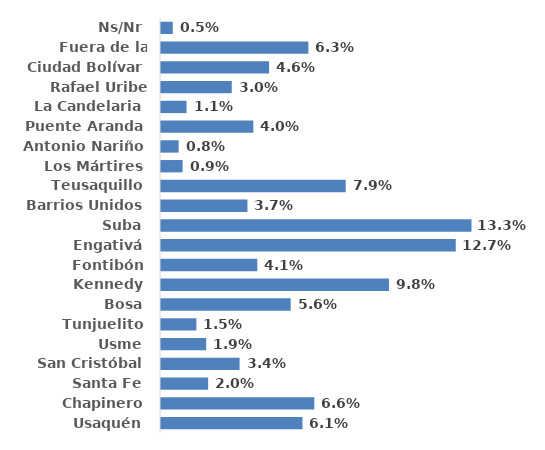
| Category | Series 0 |
|---|---|
| Usaquén | 0.061 |
| Chapinero | 0.066 |
| Santa Fe | 0.02 |
| San Cristóbal | 0.034 |
| Usme | 0.019 |
| Tunjuelito | 0.015 |
| Bosa | 0.056 |
| Kennedy | 0.098 |
| Fontibón | 0.041 |
| Engativá | 0.127 |
| Suba | 0.133 |
| Barrios Unidos | 0.037 |
| Teusaquillo | 0.079 |
| Los Mártires | 0.009 |
| Antonio Nariño | 0.008 |
| Puente Aranda | 0.04 |
| La Candelaria | 0.011 |
| Rafael Uribe Uribe | 0.03 |
| Ciudad Bolívar | 0.046 |
| Fuera de la ciudad | 0.063 |
| Ns/Nr | 0.005 |